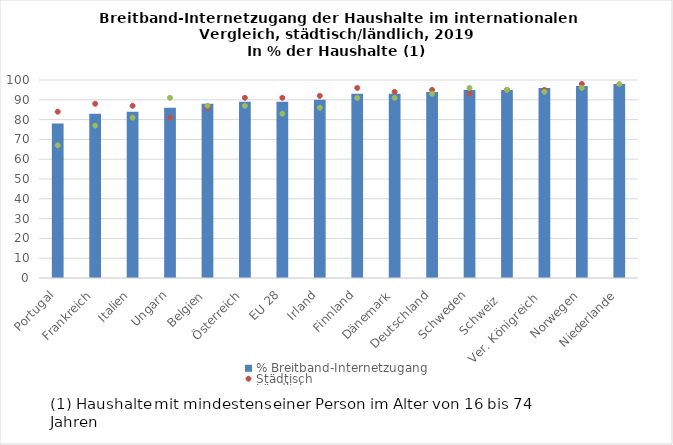
| Category | % Breitband-Internetzugang |
|---|---|
| Portugal | 78 |
| Frankreich | 83 |
| Italien | 84 |
| Ungarn | 86 |
| Belgien | 88 |
| Österreich | 89 |
| EU 28 | 89 |
| Irland | 90 |
| Finnland | 93 |
| Dänemark | 93 |
| Deutschland | 94 |
| Schweden | 95 |
| Schweiz   | 95 |
| Ver. Königreich  | 96 |
| Norwegen | 97 |
| Niederlande | 98 |